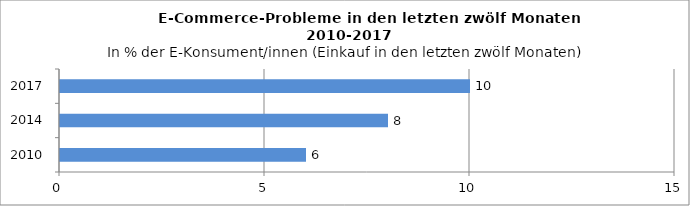
| Category | Auftreten eines Problems  |
|---|---|
| 2010.0 | 6 |
| 2014.0 | 8 |
| 2017.0 | 10 |